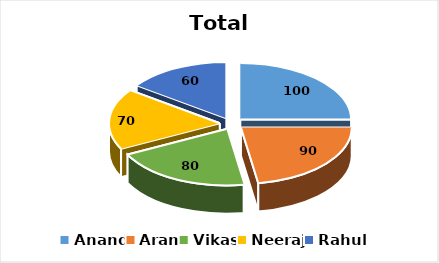
| Category | Total marks |
|---|---|
| Anand | 100 |
| Aran | 90 |
| Vikas | 80 |
| Neeraj | 70 |
| Rahul | 60 |